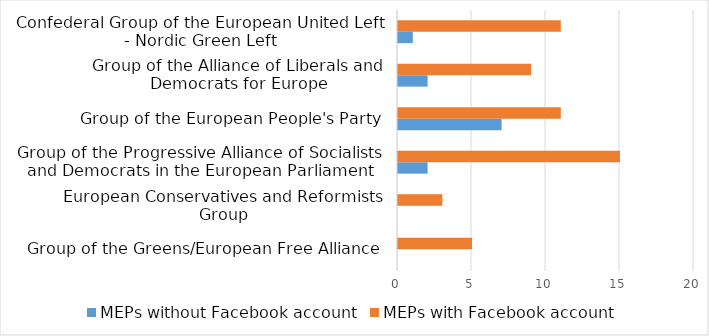
| Category | MEPs without Facebook account | MEPs with Facebook account |
|---|---|---|
| Group of the Greens/European Free Alliance | 0 | 5 |
| European Conservatives and Reformists Group | 0 | 3 |
| Group of the Progressive Alliance of Socialists and Democrats in the European Parliament | 2 | 15 |
| Group of the European People's Party | 7 | 11 |
| Group of the Alliance of Liberals and Democrats for Europe | 2 | 9 |
| Confederal Group of the European United Left - Nordic Green Left | 1 | 11 |